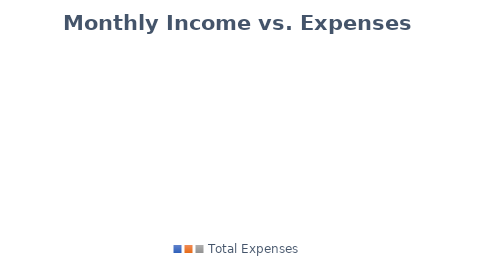
| Category | Series 0 |
|---|---|
|  | 0 |
|  | 0 |
| Total Expenses | 0 |